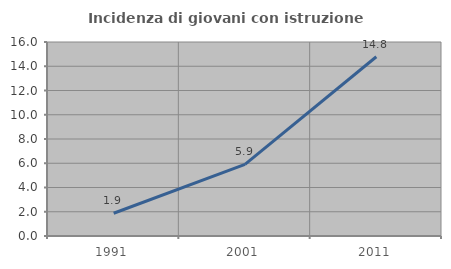
| Category | Incidenza di giovani con istruzione universitaria |
|---|---|
| 1991.0 | 1.878 |
| 2001.0 | 5.907 |
| 2011.0 | 14.783 |